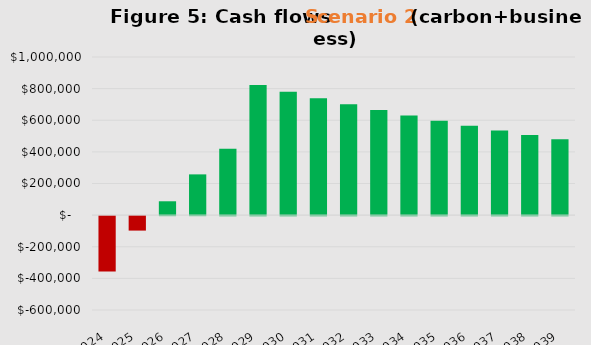
| Category | Series 0 |
|---|---|
| 2024.0 | -350000 |
| 2025.0 | -91500 |
| 2026.0 | 87575 |
| 2027.0 | 257696.25 |
| 2028.0 | 419311.438 |
| 2029.0 | 822845.866 |
| 2030.0 | 780203.572 |
| 2031.0 | 739693.394 |
| 2032.0 | 701208.724 |
| 2033.0 | 664648.288 |
| 2034.0 | 629915.873 |
| 2035.0 | 596920.08 |
| 2036.0 | 565574.076 |
| 2037.0 | 535795.372 |
| 2038.0 | 507505.603 |
| 2039.0 | 480630.323 |